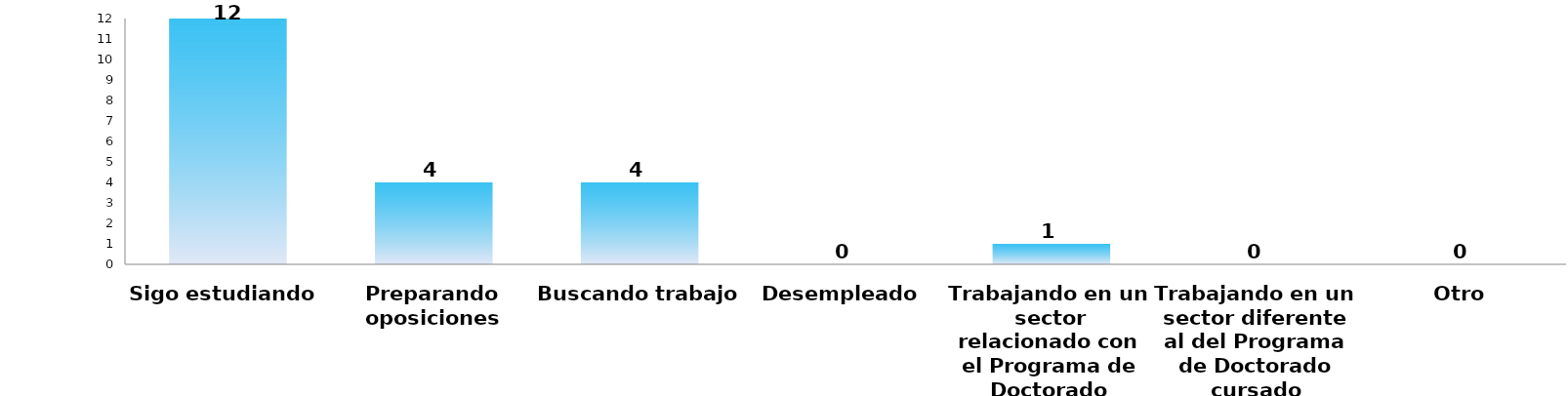
| Category | Series 0 |
|---|---|
| Sigo estudiando | 12 |
| Preparando oposiciones | 4 |
| Buscando trabajo | 4 |
| Desempleado | 0 |
| Trabajando en un sector relacionado con el Programa de Doctorado cursado | 1 |
| Trabajando en un sector diferente al del Programa de Doctorado cursado | 0 |
| Otro | 0 |